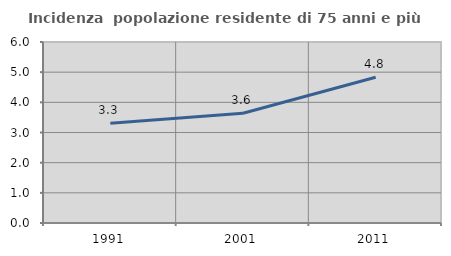
| Category | Incidenza  popolazione residente di 75 anni e più |
|---|---|
| 1991.0 | 3.308 |
| 2001.0 | 3.637 |
| 2011.0 | 4.831 |